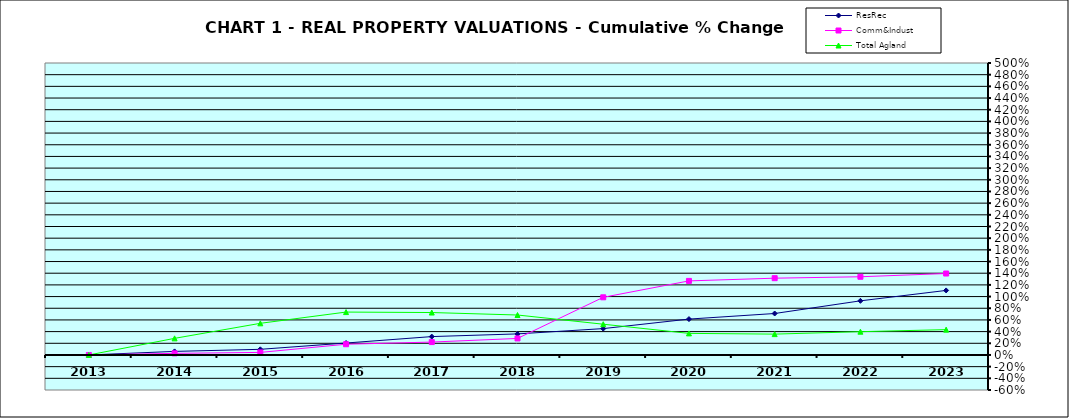
| Category | ResRec | Comm&Indust | Total Agland |
|---|---|---|---|
| 2013.0 | 0 | 0 | 0 |
| 2014.0 | 0.061 | 0.028 | 0.285 |
| 2015.0 | 0.097 | 0.044 | 0.542 |
| 2016.0 | 0.204 | 0.184 | 0.735 |
| 2017.0 | 0.315 | 0.221 | 0.727 |
| 2018.0 | 0.361 | 0.283 | 0.684 |
| 2019.0 | 0.452 | 0.987 | 0.527 |
| 2020.0 | 0.614 | 1.269 | 0.37 |
| 2021.0 | 0.71 | 1.315 | 0.357 |
| 2022.0 | 0.927 | 1.339 | 0.399 |
| 2023.0 | 1.105 | 1.395 | 0.434 |